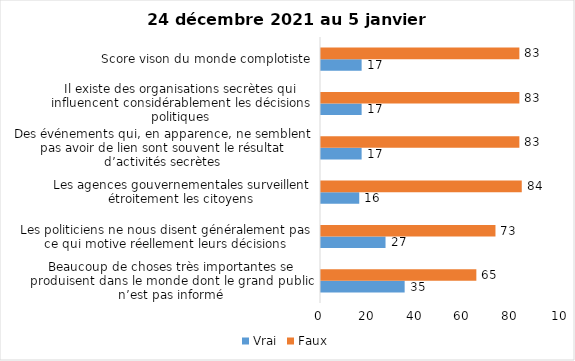
| Category | Vrai | Faux |
|---|---|---|
| Beaucoup de choses très importantes se produisent dans le monde dont le grand public n’est pas informé | 35 | 65 |
| Les politiciens ne nous disent généralement pas ce qui motive réellement leurs décisions | 27 | 73 |
| Les agences gouvernementales surveillent étroitement les citoyens | 16 | 84 |
| Des événements qui, en apparence, ne semblent pas avoir de lien sont souvent le résultat d’activités secrètes | 17 | 83 |
| Il existe des organisations secrètes qui influencent considérablement les décisions politiques | 17 | 83 |
| Score vison du monde complotiste | 17 | 83 |